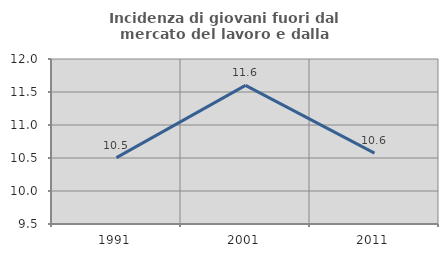
| Category | Incidenza di giovani fuori dal mercato del lavoro e dalla formazione  |
|---|---|
| 1991.0 | 10.506 |
| 2001.0 | 11.6 |
| 2011.0 | 10.574 |